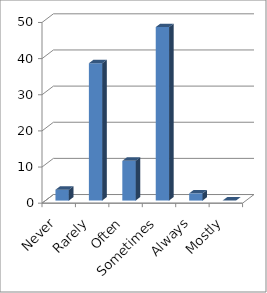
| Category | Series 0 |
|---|---|
| Never | 3 |
| Rarely | 38 |
| Often | 11 |
| Sometimes | 48 |
| Always | 2 |
| Mostly | 0 |